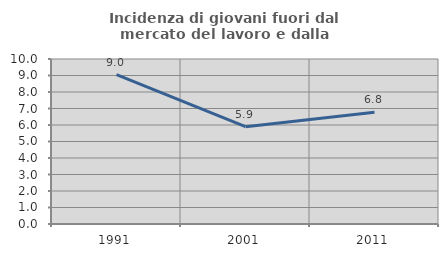
| Category | Incidenza di giovani fuori dal mercato del lavoro e dalla formazione  |
|---|---|
| 1991.0 | 9.048 |
| 2001.0 | 5.899 |
| 2011.0 | 6.774 |